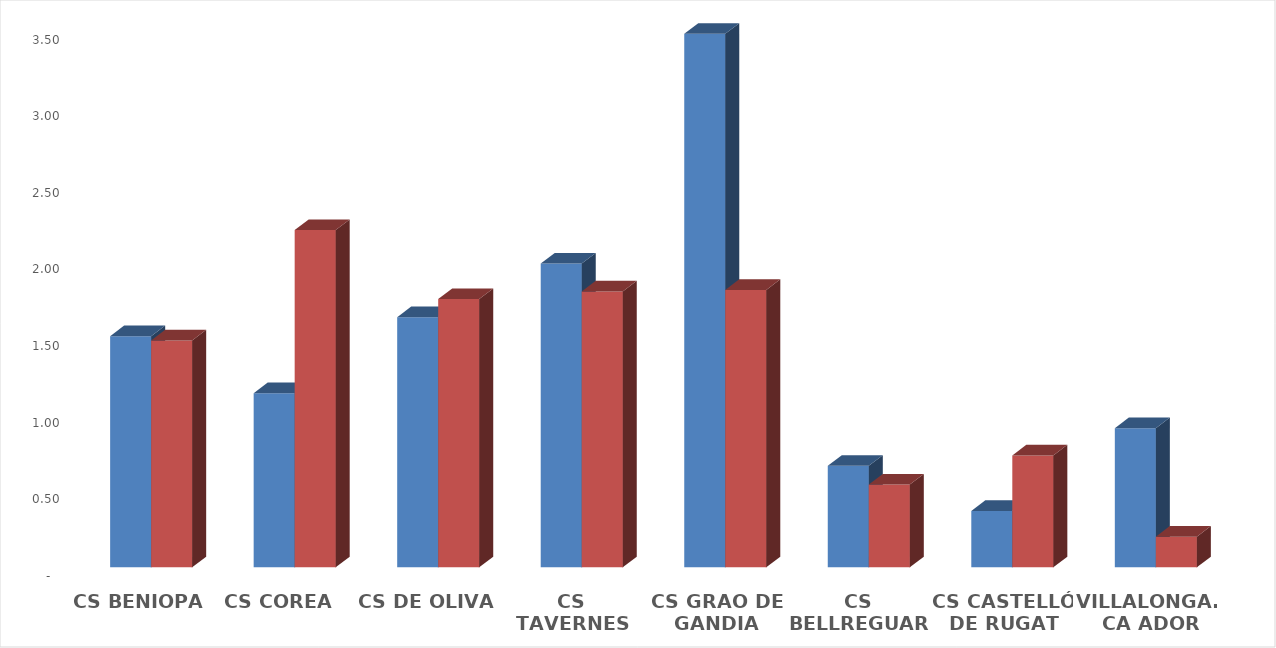
| Category | Series 0 | Series 1 |
|---|---|---|
| CS BENIOPA | 1.508 | 1.48 |
| CS COREA  | 1.136 | 2.2 |
| CS DE OLIVA | 1.632 | 1.75 |
| CS TAVERNES DE VALLDIGNA | 1.982 | 1.8 |
| CS GRAO DE GANDIA | 3.481 | 1.81 |
| CS BELLREGUARD | 0.662 | 0.54 |
| CS CASTELLÓ DE RUGAT | 0.368 | 0.73 |
| VILLALONGA.  CA ADOR | 0.908 | 0.2 |